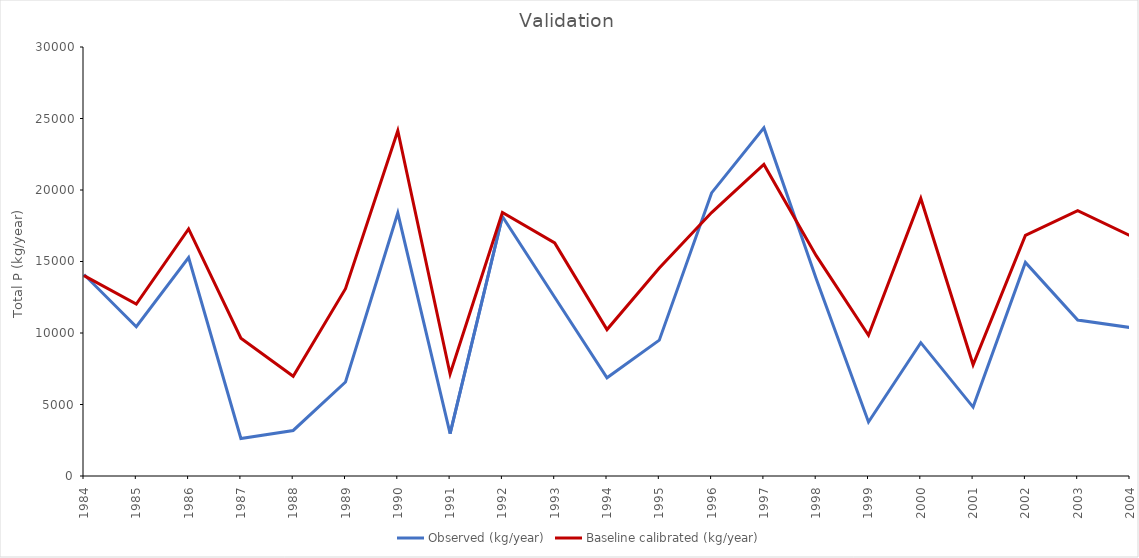
| Category | Observed (kg/year) | Baseline calibrated (kg/year) |
|---|---|---|
| 1984.0 | 14091.222 | 14010 |
| 1985.0 | 10436.02 | 12020 |
| 1986.0 | 15271.165 | 17280 |
| 1987.0 | 2623.469 | 9638 |
| 1988.0 | 3184.182 | 6975 |
| 1989.0 | 6570.498 | 13100 |
| 1990.0 | 18389.16 | 24150 |
| 1991.0 | 2969.08 | 7131 |
| 1992.0 | 18153.083 | 18430 |
| 1993.0 | 12500.193 | 16300 |
| 1994.0 | 6867.517 | 10240 |
| 1995.0 | 9501.466 | 14540 |
| 1996.0 | 19797.299 | 18420 |
| 1997.0 | 24342.25 | 21790 |
| 1998.0 | 13787.617 | 15410 |
| 1999.0 | 3773.579 | 9836 |
| 2000.0 | 9323.154 | 19410 |
| 2001.0 | 4818.544 | 7782 |
| 2002.0 | 14936.897 | 16820 |
| 2003.0 | 10904.803 | 18560 |
| 2004.0 | 10384.197 | 16810 |